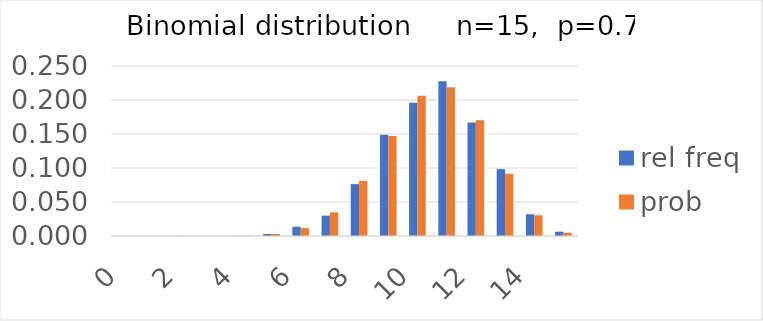
| Category | rel freq | prob |
|---|---|---|
| 0.0 | 0 | 0 |
| 1.0 | 0 | 0 |
| 2.0 | 0 | 0 |
| 3.0 | 0 | 0 |
| 4.0 | 0 | 0.001 |
| 5.0 | 0.003 | 0.003 |
| 6.0 | 0.014 | 0.012 |
| 7.0 | 0.03 | 0.035 |
| 8.0 | 0.076 | 0.081 |
| 9.0 | 0.149 | 0.147 |
| 10.0 | 0.196 | 0.206 |
| 11.0 | 0.228 | 0.219 |
| 12.0 | 0.167 | 0.17 |
| 13.0 | 0.098 | 0.092 |
| 14.0 | 0.032 | 0.031 |
| 15.0 | 0.006 | 0.005 |